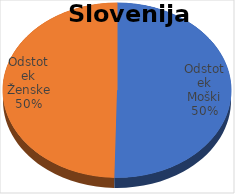
| Category | Slovenija skupaj |
|---|---|
| Odstotek Moški | 10.9 |
| Odstotek Ženske | 10.74 |